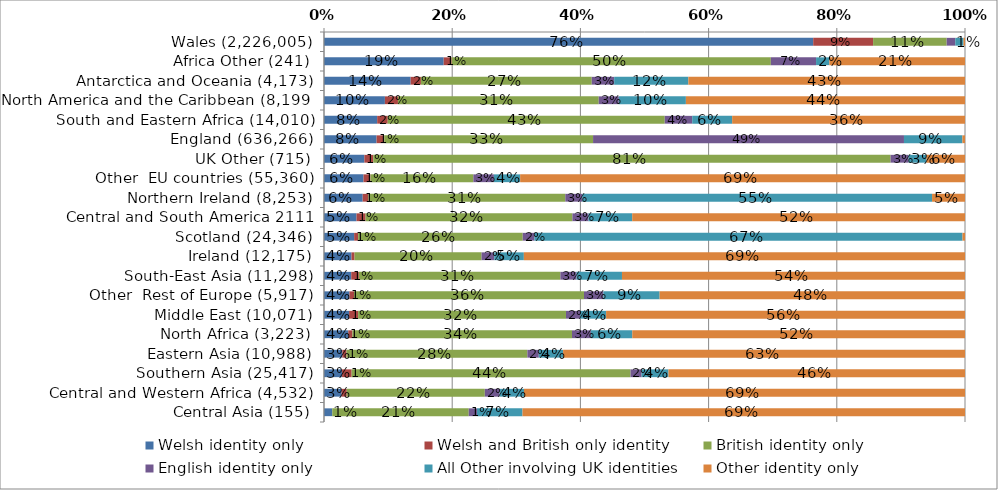
| Category | Welsh identity only | Welsh and British only identity | British identity only | English identity only | All Other involving UK identities  | Other identity only |
|---|---|---|---|---|---|---|
| Wales (2,226,005) | 0.763 | 0.093 | 0.115 | 0.013 | 0.013 | 0.002 |
| Africa Other (241) | 0.187 | 0.012 | 0.498 | 0.071 | 0.021 | 0.212 |
| Antarctica and Oceania (4,173) | 0.135 | 0.016 | 0.266 | 0.035 | 0.116 | 0.432 |
| North America and the Caribbean (8,199) | 0.095 | 0.02 | 0.313 | 0.031 | 0.105 | 0.435 |
| South and Eastern Africa (14,010) | 0.083 | 0.016 | 0.432 | 0.043 | 0.062 | 0.363 |
| England (636,266) | 0.082 | 0.012 | 0.326 | 0.485 | 0.091 | 0.004 |
| UK Other (715) | 0.063 | 0.014 | 0.807 | 0.028 | 0.028 | 0.06 |
| Other  EU countries (55,360) | 0.062 | 0.011 | 0.16 | 0.032 | 0.041 | 0.694 |
| Northern Ireland (8,253) | 0.06 | 0.009 | 0.307 | 0.026 | 0.546 | 0.051 |
| Central and South America 2111 | 0.051 | 0.014 | 0.323 | 0.025 | 0.068 | 0.519 |
| Scotland (24,346) | 0.047 | 0.006 | 0.257 | 0.018 | 0.668 | 0.004 |
| Ireland (12,175) | 0.043 | 0.005 | 0.198 | 0.02 | 0.046 | 0.688 |
| South-East Asia (11,298) | 0.042 | 0.012 | 0.314 | 0.025 | 0.071 | 0.535 |
| Other  Rest of Europe (5,917) | 0.04 | 0.007 | 0.359 | 0.03 | 0.088 | 0.476 |
| Middle East (10,071) | 0.039 | 0.014 | 0.324 | 0.022 | 0.041 | 0.56 |
| North Africa (3,223) | 0.038 | 0.007 | 0.343 | 0.029 | 0.065 | 0.519 |
| Eastern Asia (10,988) | 0.029 | 0.006 | 0.282 | 0.018 | 0.038 | 0.627 |
| Southern Asia (25,417) | 0.028 | 0.015 | 0.435 | 0.017 | 0.042 | 0.463 |
| Central and Western Africa (4,532) | 0.027 | 0.008 | 0.215 | 0.023 | 0.038 | 0.688 |
| Central Asia (155) | 0.013 | 0 | 0.213 | 0.013 | 0.071 | 0.69 |